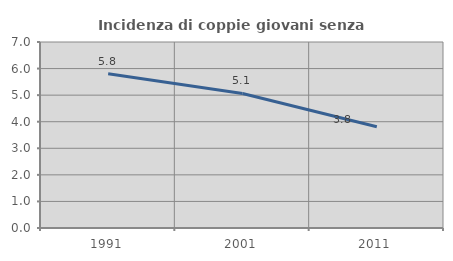
| Category | Incidenza di coppie giovani senza figli |
|---|---|
| 1991.0 | 5.802 |
| 2001.0 | 5.065 |
| 2011.0 | 3.81 |